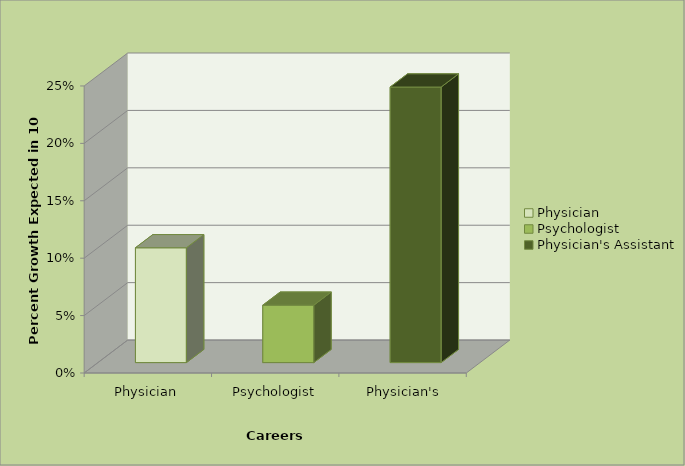
| Category | Percent Growth Expected |
|---|---|
| Physician | 0.1 |
| Psychologist | 0.05 |
| Physician's Assistant | 0.24 |